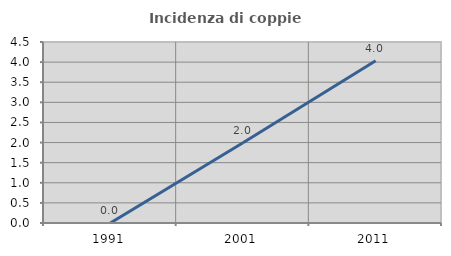
| Category | Incidenza di coppie miste |
|---|---|
| 1991.0 | 0 |
| 2001.0 | 1.994 |
| 2011.0 | 4.032 |